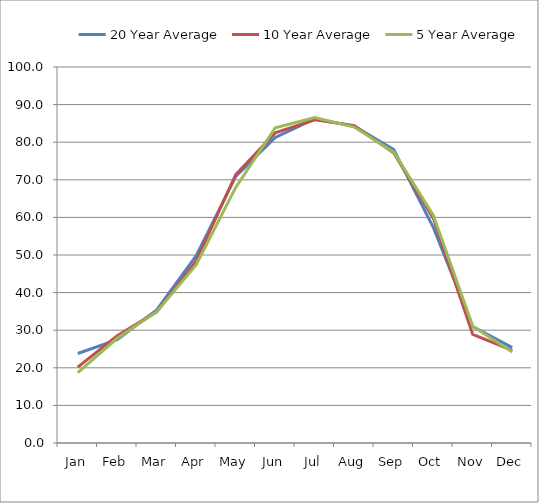
| Category | 20 Year Average | 10 Year Average | 5 Year Average |
|---|---|---|---|
| Jan | 23.807 | 20.195 | 18.696 |
| Feb | 27.456 | 28.535 | 27.852 |
| Mar | 35.415 | 34.889 | 34.91 |
| Apr | 49.822 | 48.449 | 47.438 |
| May | 70.908 | 71.357 | 67.98 |
| Jun | 81.272 | 82.481 | 83.846 |
| Jul | 86.209 | 85.975 | 86.572 |
| Aug | 84.266 | 84.411 | 84.02 |
| Sep | 78.048 | 77.14 | 77.346 |
| Oct | 57.371 | 59.808 | 60.614 |
| Nov | 30.954 | 28.871 | 31.024 |
| Dec | 25.398 | 24.622 | 24.186 |